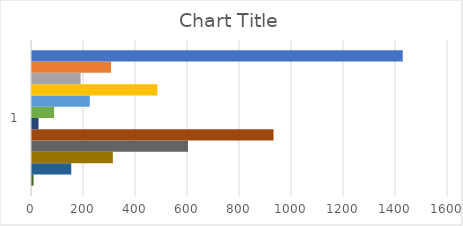
| Category | Series 11 | Series 10 | Series 9 | Series 8 | Series 7 | Series 6 | Series 5 | Series 4 | Series 3 | Series 2 | Series 1 | Series 0 |
|---|---|---|---|---|---|---|---|---|---|---|---|---|
| 0 | 6 | 151 | 311 | 600 | 929 | 25 | 85 | 222 | 482 | 187 | 304 | 1426 |